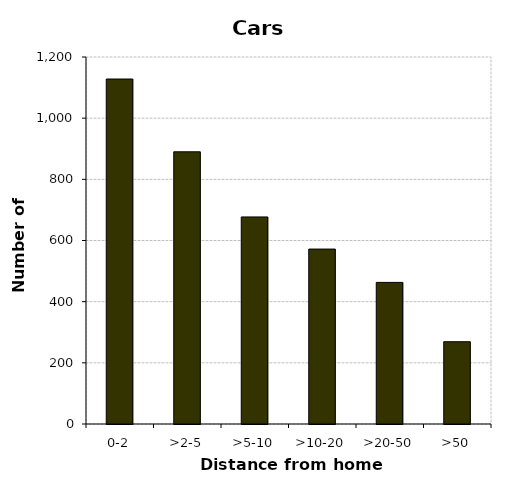
| Category | Cars |
|---|---|
| 0-2 | 1128 |
| >2-5 | 890 |
| >5-10 | 677 |
| >10-20 | 572 |
| >20-50 | 463 |
| >50 | 269 |